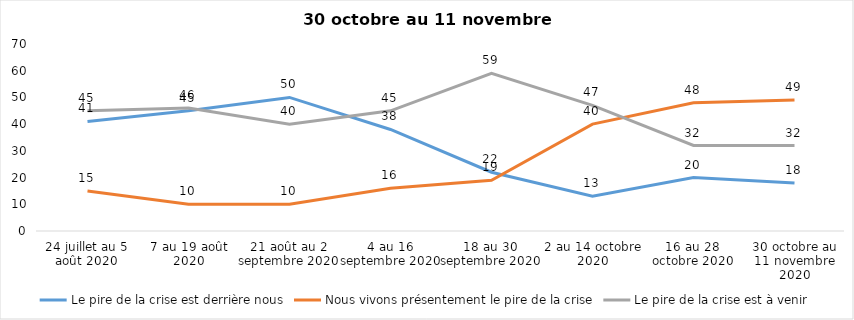
| Category | Le pire de la crise est derrière nous | Nous vivons présentement le pire de la crise | Le pire de la crise est à venir |
|---|---|---|---|
| 24 juillet au 5 août 2020 | 41 | 15 | 45 |
| 7 au 19 août 2020 | 45 | 10 | 46 |
| 21 août au 2 septembre 2020 | 50 | 10 | 40 |
| 4 au 16 septembre 2020 | 38 | 16 | 45 |
| 18 au 30 septembre 2020 | 22 | 19 | 59 |
| 2 au 14 octobre 2020 | 13 | 40 | 47 |
| 16 au 28 octobre 2020 | 20 | 48 | 32 |
| 30 octobre au 11 novembre 2020 | 18 | 49 | 32 |